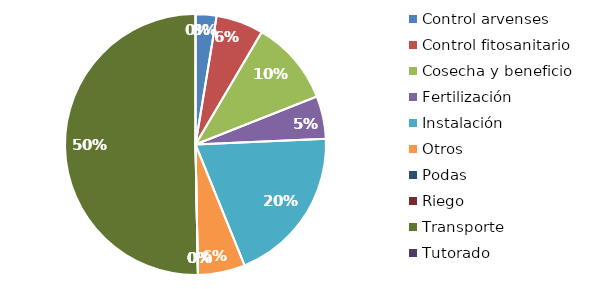
| Category | Valor |
|---|---|
| Control arvenses | 57082 |
| Control fitosanitario | 129267 |
| Cosecha y beneficio | 231636 |
| Fertilización | 116538 |
| Instalación | 430131 |
| Otros | 128332 |
| Podas | 0 |
| Riego | 0 |
| Transporte | 1106158 |
| Tutorado | 0 |